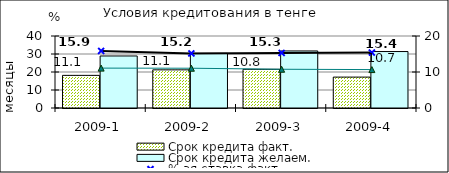
| Category | Срок кредита факт.  | Срок кредита желаем. |
|---|---|---|
| 2009-1 | 18.13 | 28.9 |
| 2009-2 | 21.19 | 30.36 |
| 2009-3 | 21.5 | 31.7 |
| 2009-4 | 17.17 | 31.37 |